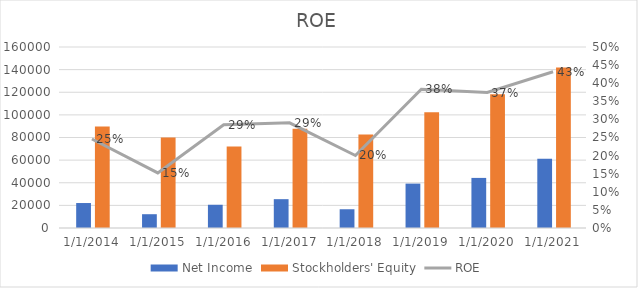
| Category | Net Income | Stockholders' Equity |
|---|---|---|
| 12/31/14 | 22074 | 89784 |
| 12/31/15 | 12193 | 80083 |
| 12/31/16 | 20539 | 71997 |
| 12/31/17 | 25489 | 87711 |
| 12/31/18 | 16571 | 82718 |
| 12/31/19 | 39240 | 102330 |
| 12/31/20 | 44281 | 118304 |
| 12/31/21 | 61271 | 141988 |